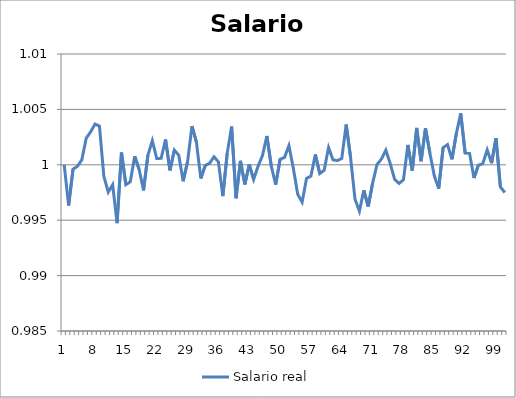
| Category | Salario real |
|---|---|
| 0 | 1 |
| 1 | 0.996 |
| 2 | 1 |
| 3 | 1 |
| 4 | 1 |
| 5 | 1.002 |
| 6 | 1.003 |
| 7 | 1.004 |
| 8 | 1.003 |
| 9 | 0.999 |
| 10 | 0.998 |
| 11 | 0.998 |
| 12 | 0.995 |
| 13 | 1.001 |
| 14 | 0.998 |
| 15 | 0.998 |
| 16 | 1.001 |
| 17 | 1 |
| 18 | 0.998 |
| 19 | 1.001 |
| 20 | 1.002 |
| 21 | 1.001 |
| 22 | 1.001 |
| 23 | 1.002 |
| 24 | 0.999 |
| 25 | 1.001 |
| 26 | 1.001 |
| 27 | 0.999 |
| 28 | 1 |
| 29 | 1.003 |
| 30 | 1.002 |
| 31 | 0.999 |
| 32 | 1 |
| 33 | 1 |
| 34 | 1.001 |
| 35 | 1 |
| 36 | 0.997 |
| 37 | 1.001 |
| 38 | 1.003 |
| 39 | 0.997 |
| 40 | 1 |
| 41 | 0.998 |
| 42 | 1 |
| 43 | 0.999 |
| 44 | 1 |
| 45 | 1.001 |
| 46 | 1.003 |
| 47 | 1 |
| 48 | 0.998 |
| 49 | 1 |
| 50 | 1.001 |
| 51 | 1.002 |
| 52 | 1 |
| 53 | 0.997 |
| 54 | 0.997 |
| 55 | 0.999 |
| 56 | 0.999 |
| 57 | 1.001 |
| 58 | 0.999 |
| 59 | 1 |
| 60 | 1.002 |
| 61 | 1 |
| 62 | 1 |
| 63 | 1.001 |
| 64 | 1.004 |
| 65 | 1.001 |
| 66 | 0.997 |
| 67 | 0.996 |
| 68 | 0.998 |
| 69 | 0.996 |
| 70 | 0.998 |
| 71 | 1 |
| 72 | 1.001 |
| 73 | 1.001 |
| 74 | 1 |
| 75 | 0.999 |
| 76 | 0.998 |
| 77 | 0.999 |
| 78 | 1.002 |
| 79 | 0.999 |
| 80 | 1.003 |
| 81 | 1 |
| 82 | 1.003 |
| 83 | 1.001 |
| 84 | 0.999 |
| 85 | 0.998 |
| 86 | 1.002 |
| 87 | 1.002 |
| 88 | 1 |
| 89 | 1.003 |
| 90 | 1.005 |
| 91 | 1.001 |
| 92 | 1.001 |
| 93 | 0.999 |
| 94 | 1 |
| 95 | 1 |
| 96 | 1.001 |
| 97 | 1 |
| 98 | 1.002 |
| 99 | 0.998 |
| 100 | 0.997 |